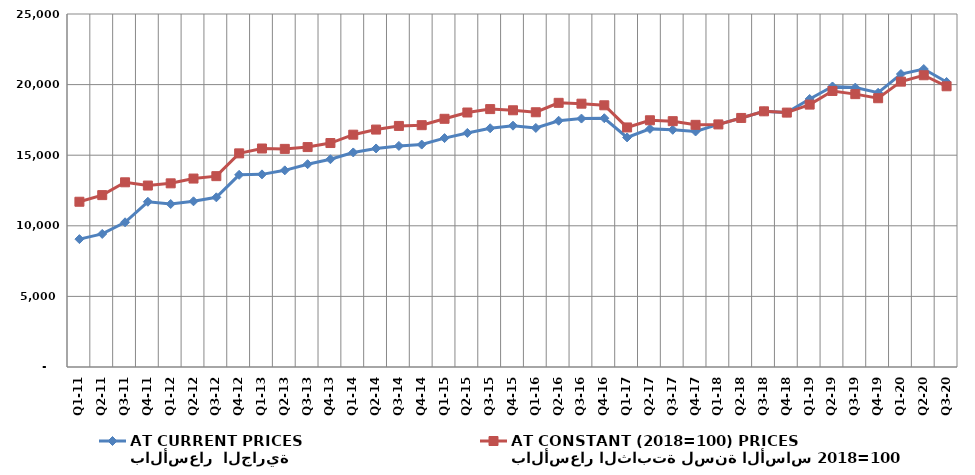
| Category | بالأسعار  الجارية 
AT CURRENT PRICES | بالأسعار الثابتة لسنة الأساس 2018=100
AT CONSTANT (2018=100) PRICES |
|---|---|---|
| Q1-11 | 9055.954 | 11704.074 |
| Q2-11 | 9423.516 | 12173.147 |
| Q3-11 | 10247.853 | 13080.288 |
| Q4-11 | 11701.559 | 12850.58 |
| Q1-12 | 11543.1 | 13007.692 |
| Q2-12 | 11735.177 | 13346.391 |
| Q3-12 | 12016.042 | 13516.137 |
| Q4-12 | 13610.438 | 15129.767 |
| Q1-13 | 13643.035 | 15473.757 |
| Q2-13 | 13927.116 | 15446.962 |
| Q3-13 | 14362.42 | 15574.973 |
| Q4-13 | 14714.331 | 15861.642 |
| Q1-14 | 15195.326 | 16453.802 |
| Q2-14 | 15477.558 | 16815.107 |
| Q3-14 | 15657.591 | 17072.528 |
| Q4-14 | 15753.334 | 17126.619 |
| Q1-15 | 16211.707 | 17577.857 |
| Q2-15 | 16577.305 | 18023.774 |
| Q3-15 | 16906.669 | 18264.647 |
| Q4-15 | 17090.236 | 18181.304 |
| Q1-16 | 16931.178 | 18041.308 |
| Q2-16 | 17440.779 | 18708.464 |
| Q3-16 | 17593.878 | 18648.686 |
| Q4-16 | 17618.204 | 18534.511 |
| Q1-17 | 16259.291 | 16966.015 |
| Q2-17 | 16864.269 | 17473.838 |
| Q3-17 | 16798.079 | 17410.433 |
| Q4-17 | 16679.701 | 17150.272 |
| Q1-18 | 17180.116 | 17180.116 |
| Q2-18 | 17638.615 | 17638.615 |
| Q3-18 | 18108.032 | 18108.032 |
| Q4-18 | 18016.873 | 18016.873 |
| Q1-19 | 18982.27 | 18583.925 |
| Q2-19 | 19867.09 | 19549.666 |
| Q3-19 | 19786.459 | 19324.69 |
| Q4-19 | 19423.763 | 19034.502 |
| Q1-20 | 20748.849 | 20209.994 |
| Q2-20 | 21103.074 | 20661.834 |
| Q3-20 | 20184.255 | 19881.404 |